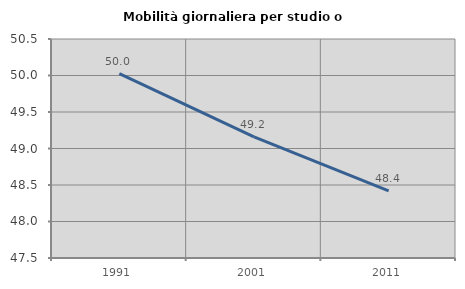
| Category | Mobilità giornaliera per studio o lavoro |
|---|---|
| 1991.0 | 50.024 |
| 2001.0 | 49.16 |
| 2011.0 | 48.419 |